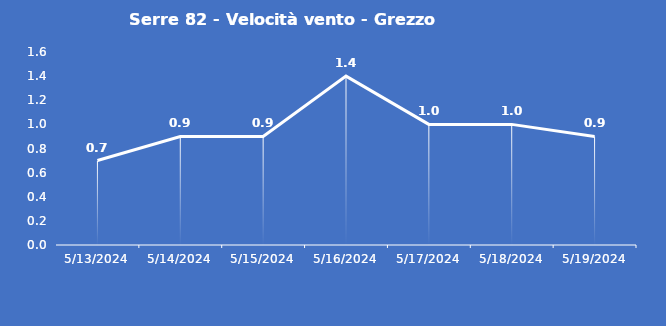
| Category | Serre 82 - Velocità vento - Grezzo (m/s) |
|---|---|
| 5/13/24 | 0.7 |
| 5/14/24 | 0.9 |
| 5/15/24 | 0.9 |
| 5/16/24 | 1.4 |
| 5/17/24 | 1 |
| 5/18/24 | 1 |
| 5/19/24 | 0.9 |